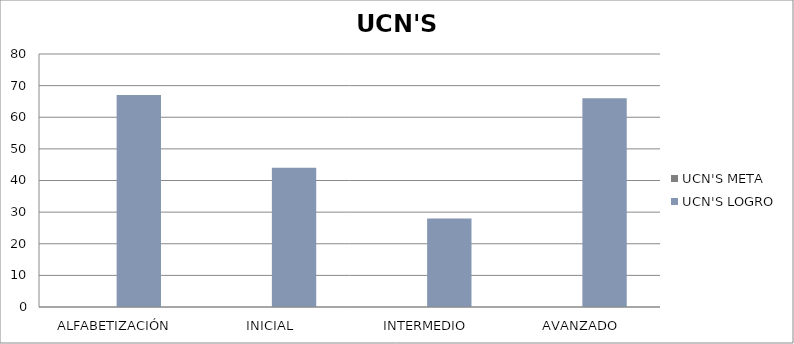
| Category | UCN'S |
|---|---|
| ALFABETIZACIÓN | 67 |
| INICIAL | 44 |
| INTERMEDIO | 28 |
| AVANZADO | 66 |